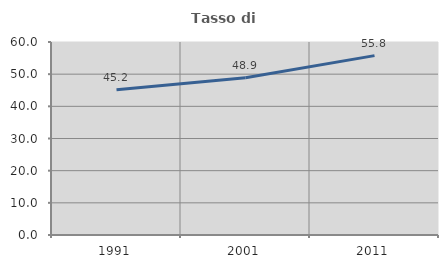
| Category | Tasso di occupazione   |
|---|---|
| 1991.0 | 45.185 |
| 2001.0 | 48.904 |
| 2011.0 | 55.761 |